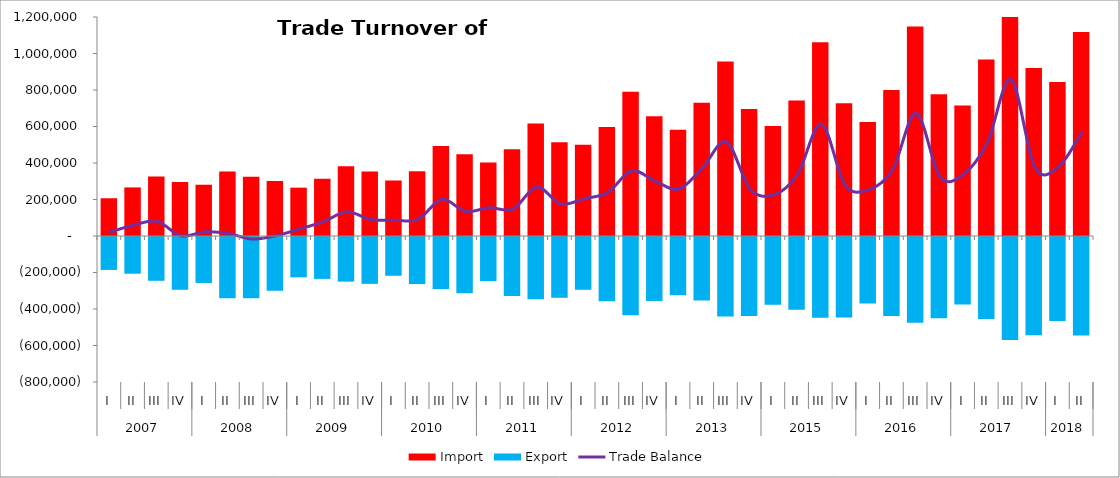
| Category | Import | Export |
|---|---|---|
| 0 | 206876.453 | -185862.119 |
| 1 | 266162.034 | -206602.171 |
| 2 | 325432.039 | -245424.789 |
| 3 | 295638.902 | -295030.919 |
| 4 | 280196.682 | -257248.178 |
| 5 | 354066.036 | -340846.499 |
| 6 | 324889.482 | -341447.222 |
| 7 | 301301.793 | -299882.459 |
| 8 | 264903.998 | -226561.536 |
| 9 | 313311.481 | -235037.426 |
| 10 | 382383.207 | -249991.263 |
| 11 | 353010.364 | -262293.067 |
| 12 | 304483.789 | -217879.02 |
| 13 | 354263.8 | -263232.936 |
| 14 | 492599.694 | -290888.678 |
| 15 | 447423.972 | -313316.693 |
| 16 | 402433.78 | -247232.2 |
| 17 | 475906.544 | -328431.291 |
| 18 | 616171.319 | -347095.2 |
| 19 | 513645.707 | -337933.603 |
| 20 | 499607.449 | -295085.361 |
| 21 | 596895.347 | -358072.392 |
| 22 | 791093.658 | -433796.826 |
| 23 | 656411.742 | -355854.896 |
| 24 | 582176.614 | -325310.604 |
| 25 | 729496.889 | -354020.424 |
| 26 | 956513.447 | -441031.269 |
| 27 | 695845.992 | -438198.975 |
| 28 | 602133.659 | -376572.246 |
| 29 | 742725.876 | -404597.572 |
| 30 | 1061185.775 | -447435.407 |
| 31 | 727096.737 | -446754.878 |
| 32 | 624569.616 | -370507.095 |
| 33 | 799859.375 | -438638.214 |
| 34 | 1147701.128 | -474916.674 |
| 35 | 776931.366 | -451354.128 |
| 36 | 714491.312 | -375970.87 |
| 37 | 967042.006 | -455164.095 |
| 38 | 1427808.272 | -569946.006 |
| 39 | 920988.9 | -543215 |
| 40 | 844143.887 | -465841.79 |
| 41 | 1117607.587 | -545310.986 |